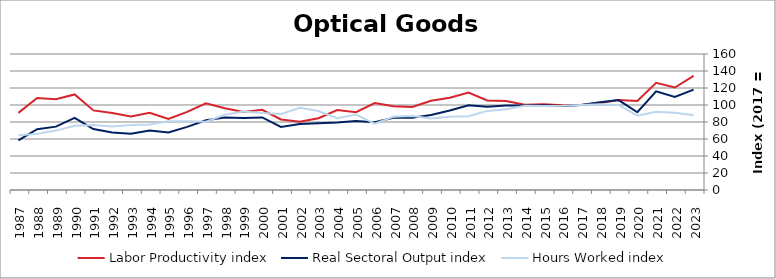
| Category | Labor Productivity index | Real Sectoral Output index | Hours Worked index |
|---|---|---|---|
| 2023.0 | 134.261 | 118.155 | 88.004 |
| 2022.0 | 120.613 | 109.586 | 90.857 |
| 2021.0 | 126.008 | 116.084 | 92.124 |
| 2020.0 | 104.622 | 91.422 | 87.382 |
| 2019.0 | 105.748 | 105.759 | 100.011 |
| 2018.0 | 102.263 | 103.105 | 100.822 |
| 2017.0 | 100 | 100 | 100 |
| 2016.0 | 99.706 | 98.839 | 99.13 |
| 2015.0 | 100.783 | 99.738 | 98.963 |
| 2014.0 | 100.179 | 99.403 | 99.226 |
| 2013.0 | 104.68 | 99.491 | 95.044 |
| 2012.0 | 105.241 | 97.949 | 93.071 |
| 2011.0 | 114.631 | 99.593 | 86.882 |
| 2010.0 | 108.537 | 93.619 | 86.255 |
| 2009.0 | 105.01 | 88.309 | 84.096 |
| 2008.0 | 97.617 | 84.896 | 86.968 |
| 2007.0 | 98.576 | 84.866 | 86.092 |
| 2006.0 | 102.293 | 79.788 | 78 |
| 2005.0 | 91.55 | 81.284 | 88.786 |
| 2004.0 | 94.05 | 79.479 | 84.507 |
| 2003.0 | 84.431 | 78.424 | 92.886 |
| 2002.0 | 80.199 | 77.541 | 96.685 |
| 2001.0 | 82.967 | 74.243 | 89.486 |
| 2000.0 | 94.3 | 85.354 | 90.513 |
| 1999.0 | 91.759 | 84.754 | 92.367 |
| 1998.0 | 96.255 | 85.204 | 88.519 |
| 1997.0 | 102.004 | 81.969 | 80.359 |
| 1996.0 | 91.934 | 74.297 | 80.816 |
| 1995.0 | 83.627 | 67.735 | 80.996 |
| 1994.0 | 90.771 | 69.929 | 77.039 |
| 1993.0 | 86.534 | 66.066 | 76.346 |
| 1992.0 | 90.468 | 67.674 | 74.804 |
| 1991.0 | 93.661 | 71.696 | 76.548 |
| 1990.0 | 112.402 | 84.967 | 75.592 |
| 1989.0 | 106.662 | 74.541 | 69.885 |
| 1988.0 | 108.232 | 71.462 | 66.027 |
| 1987.0 | 90.705 | 58.312 | 64.288 |